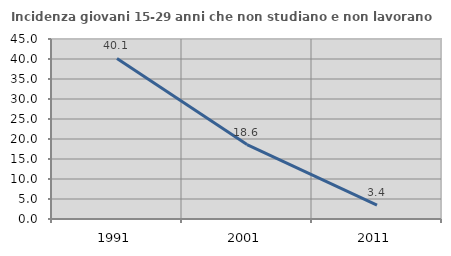
| Category | Incidenza giovani 15-29 anni che non studiano e non lavorano  |
|---|---|
| 1991.0 | 40.134 |
| 2001.0 | 18.605 |
| 2011.0 | 3.448 |